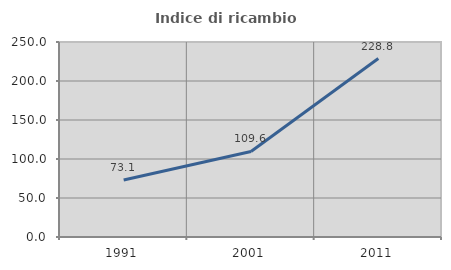
| Category | Indice di ricambio occupazionale  |
|---|---|
| 1991.0 | 73.081 |
| 2001.0 | 109.64 |
| 2011.0 | 228.794 |